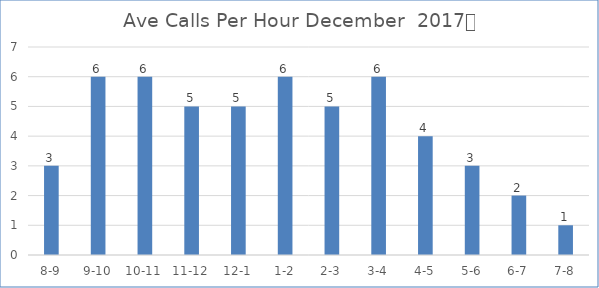
| Category | Ave Calls Per Hour |
|---|---|
| 8-9 | 3 |
| 9-10 | 6 |
| 10-11 | 6 |
| 11-12 | 5 |
| 12-1 | 5 |
| 1-2 | 6 |
| 2-3 | 5 |
| 3-4 | 6 |
| 4-5 | 4 |
| 5-6 | 3 |
| 6-7 | 2 |
| 7-8 | 1 |